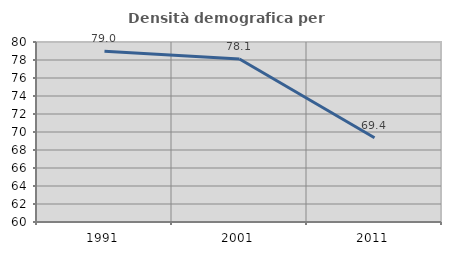
| Category | Densità demografica |
|---|---|
| 1991.0 | 78.98 |
| 2001.0 | 78.11 |
| 2011.0 | 69.352 |